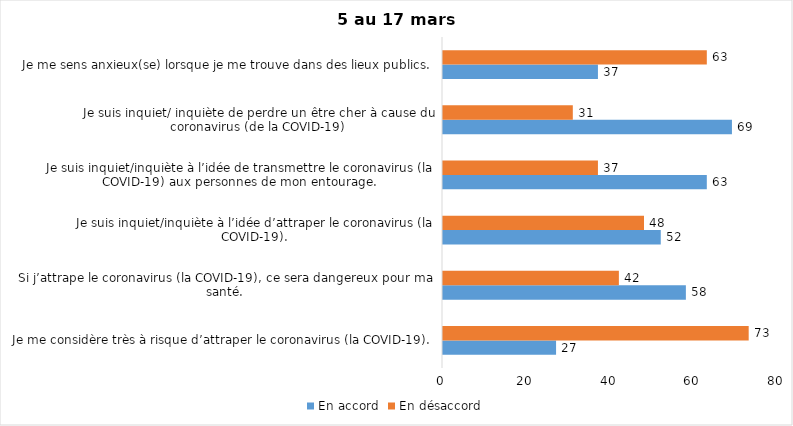
| Category | En accord | En désaccord |
|---|---|---|
| Je me considère très à risque d’attraper le coronavirus (la COVID-19). | 27 | 73 |
| Si j’attrape le coronavirus (la COVID-19), ce sera dangereux pour ma santé. | 58 | 42 |
| Je suis inquiet/inquiète à l’idée d’attraper le coronavirus (la COVID-19). | 52 | 48 |
| Je suis inquiet/inquiète à l’idée de transmettre le coronavirus (la COVID-19) aux personnes de mon entourage. | 63 | 37 |
| Je suis inquiet/ inquiète de perdre un être cher à cause du coronavirus (de la COVID-19) | 69 | 31 |
| Je me sens anxieux(se) lorsque je me trouve dans des lieux publics. | 37 | 63 |